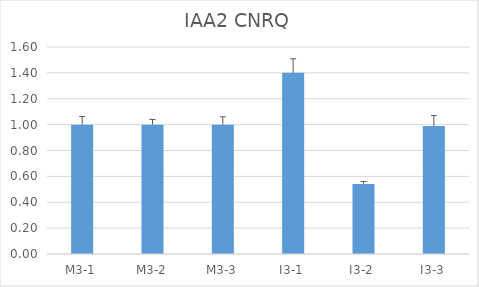
| Category | IAA2 CNRQ |
|---|---|
| M3-1 | 1 |
| M3-2 | 1 |
| M3-3 | 1 |
| I3-1 | 1.401 |
| I3-2 | 0.542 |
| I3-3 | 0.99 |